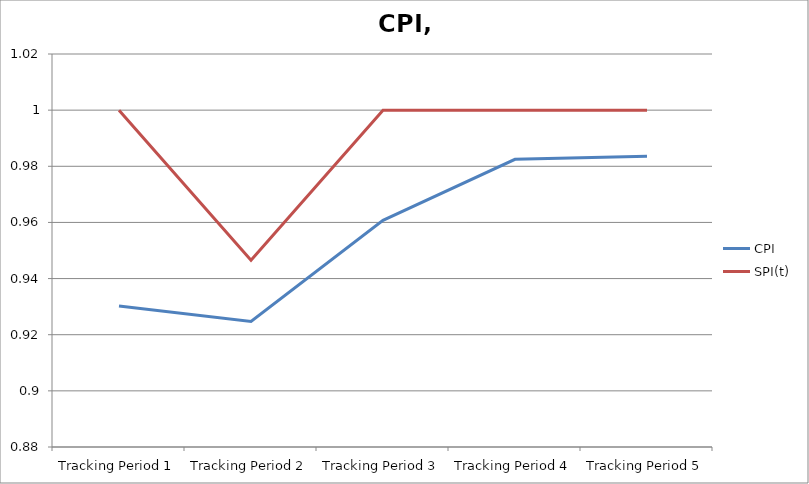
| Category | CPI | SPI(t) |
|---|---|---|
| Tracking Period 1 | 0.93 | 1 |
| Tracking Period 2 | 0.925 | 0.947 |
| Tracking Period 3 | 0.961 | 1 |
| Tracking Period 4 | 0.982 | 1 |
| Tracking Period 5 | 0.984 | 1 |